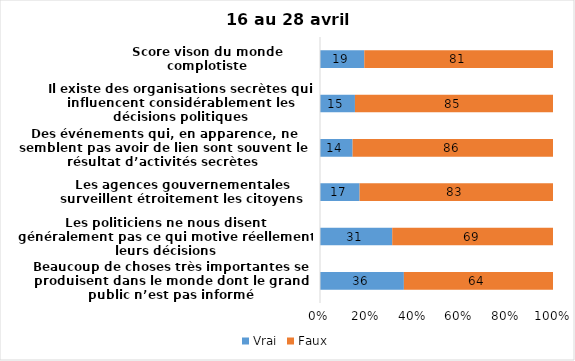
| Category | Vrai | Faux |
|---|---|---|
| Beaucoup de choses très importantes se produisent dans le monde dont le grand public n’est pas informé | 36 | 64 |
| Les politiciens ne nous disent généralement pas ce qui motive réellement leurs décisions | 31 | 69 |
| Les agences gouvernementales surveillent étroitement les citoyens | 17 | 83 |
| Des événements qui, en apparence, ne semblent pas avoir de lien sont souvent le résultat d’activités secrètes | 14 | 86 |
| Il existe des organisations secrètes qui influencent considérablement les décisions politiques | 15 | 85 |
| Score vison du monde complotiste | 19 | 81 |